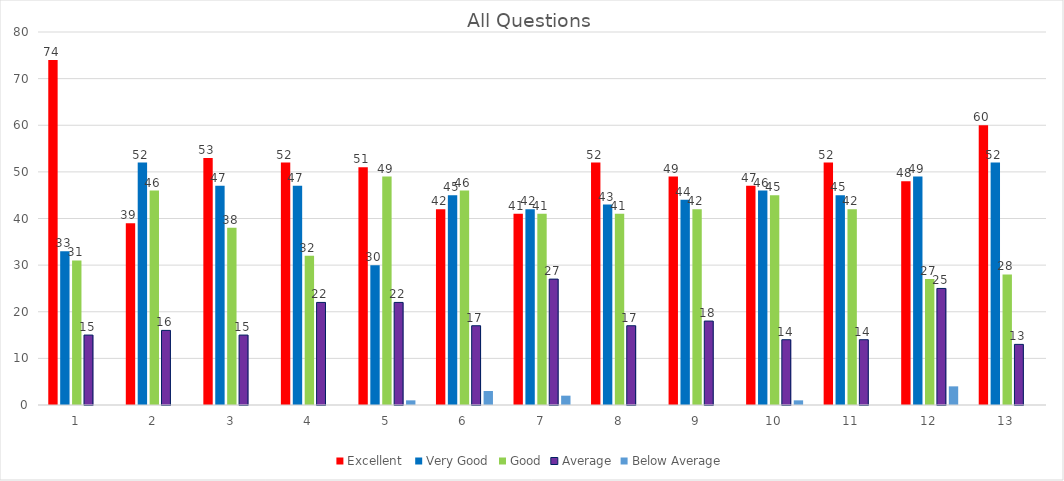
| Category | Excellent  | Very Good | Good | Average | Below Average |
|---|---|---|---|---|---|
| 1.0 | 74 | 33 | 31 | 15 | 0 |
| 2.0 | 39 | 52 | 46 | 16 | 0 |
| 3.0 | 53 | 47 | 38 | 15 | 0 |
| 4.0 | 52 | 47 | 32 | 22 | 0 |
| 5.0 | 51 | 30 | 49 | 22 | 1 |
| 6.0 | 42 | 45 | 46 | 17 | 3 |
| 7.0 | 41 | 42 | 41 | 27 | 2 |
| 8.0 | 52 | 43 | 41 | 17 | 0 |
| 9.0 | 49 | 44 | 42 | 18 | 0 |
| 10.0 | 47 | 46 | 45 | 14 | 1 |
| 11.0 | 52 | 45 | 42 | 14 | 0 |
| 12.0 | 48 | 49 | 27 | 25 | 4 |
| 13.0 | 60 | 52 | 28 | 13 | 0 |